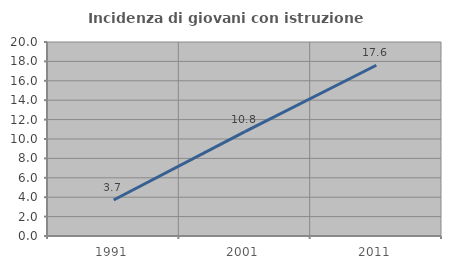
| Category | Incidenza di giovani con istruzione universitaria |
|---|---|
| 1991.0 | 3.714 |
| 2001.0 | 10.767 |
| 2011.0 | 17.604 |